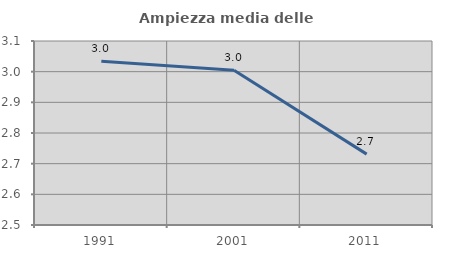
| Category | Ampiezza media delle famiglie |
|---|---|
| 1991.0 | 3.034 |
| 2001.0 | 3.005 |
| 2011.0 | 2.731 |